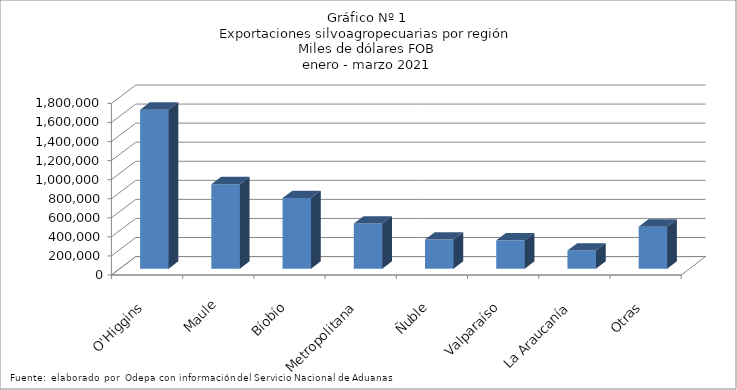
| Category | Series 0 |
|---|---|
| O'Higgins | 1668015.682 |
| Maule | 886034.484 |
| Bíobío | 740884.119 |
| Metropolitana | 473655.634 |
| Ñuble | 305280.548 |
| Valparaíso | 297586.082 |
| La Araucanía | 190559.372 |
| Otras | 440022.019 |